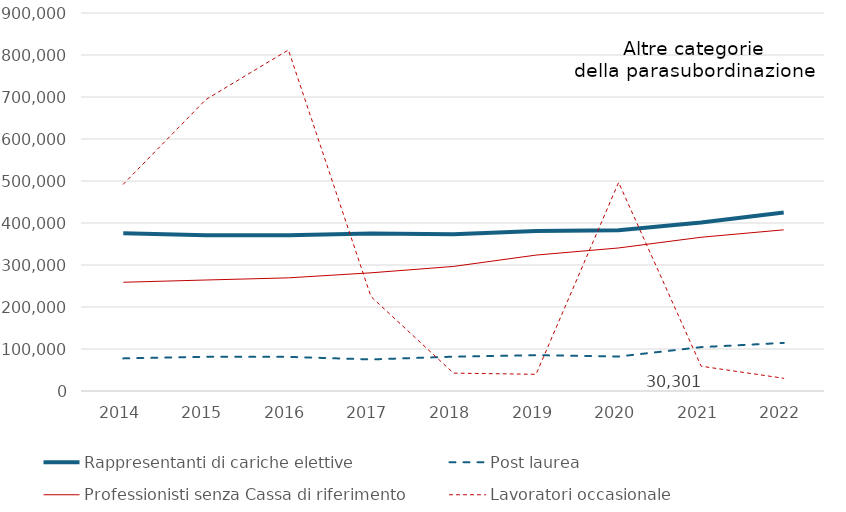
| Category | Rappresentanti di cariche elettive | Post laurea | Professionisti senza Cassa di riferimento | Lavoratori occasionale |
|---|---|---|---|---|
| 2014.0 | 375550 | 77633 | 258912 | 492339 |
| 2015.0 | 370681 | 81419 | 264284 | 693878 |
| 2016.0 | 370580 | 81246 | 269419 | 812096 |
| 2017.0 | 374949 | 75177 | 281362 | 224828 |
| 2018.0 | 372937 | 81728 | 296599 | 42531 |
| 2019.0 | 381115 | 85290 | 323592 | 39743 |
| 2020.0 | 382914 | 82150 | 340579 | 496606 |
| 2021.0 | 401079 | 104448 | 366078 | 58997 |
| 2022.0 | 425062 | 114530 | 383725 | 30301 |